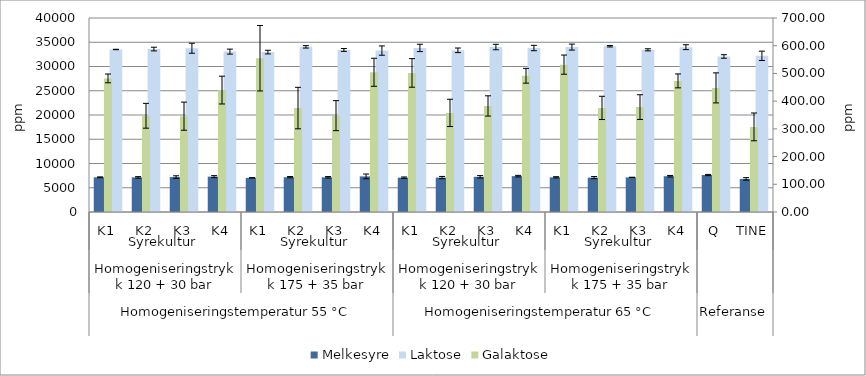
| Category | Melkesyre | Laktose |
|---|---|---|
| 0 | 7152.657 | 33507.293 |
| 1 | 7136.547 | 33596.2 |
| 2 | 7204.25 | 33765.597 |
| 3 | 7290.9 | 33067.59 |
| 4 | 7043.263 | 32968.557 |
| 5 | 7173.067 | 34054.253 |
| 6 | 7152.917 | 33411.88 |
| 7 | 7342.893 | 33283.6 |
| 8 | 7081.4 | 33831.697 |
| 9 | 7096.64 | 33336.747 |
| 10 | 7254.643 | 34017.913 |
| 11 | 7392.05 | 33808.473 |
| 12 | 7150.003 | 34002.09 |
| 13 | 7086.417 | 34175.357 |
| 14 | 7135.237 | 33442.653 |
| 15 | 7377.063 | 33982.757 |
| 16 | 7622.743 | 32069.66 |
| 17 | 6825.333 | 32201.233 |